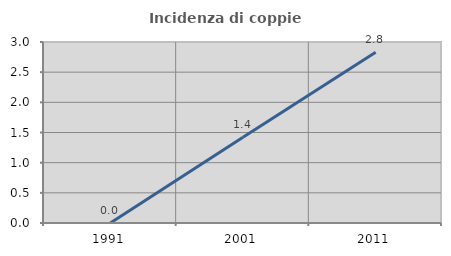
| Category | Incidenza di coppie miste |
|---|---|
| 1991.0 | 0 |
| 2001.0 | 1.423 |
| 2011.0 | 2.828 |